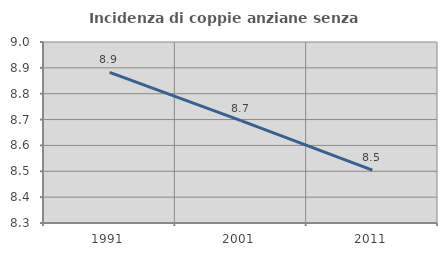
| Category | Incidenza di coppie anziane senza figli  |
|---|---|
| 1991.0 | 8.883 |
| 2001.0 | 8.696 |
| 2011.0 | 8.504 |